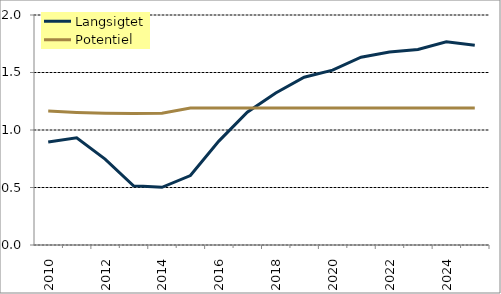
| Category | Langsigtet | Potentiel |
|---|---|---|
| 2010-01-01 | 0.896 | 1.165 |
| 2011-01-01 | 0.933 | 1.153 |
| 2012-01-01 | 0.747 | 1.146 |
| 2013-01-01 | 0.515 | 1.143 |
| 2014-01-01 | 0.502 | 1.146 |
| 2015-01-01 | 0.604 | 1.19 |
| 2016-01-01 | 0.903 | 1.19 |
| 2017-01-01 | 1.154 | 1.19 |
| 2018-01-01 | 1.322 | 1.19 |
| 2019-01-01 | 1.459 | 1.19 |
| 2020-01-01 | 1.52 | 1.19 |
| 2021-01-01 | 1.633 | 1.19 |
| 2022-01-01 | 1.678 | 1.19 |
| 2023-01-01 | 1.701 | 1.19 |
| 2024-01-01 | 1.766 | 1.19 |
| 2025-01-01 | 1.738 | 1.19 |